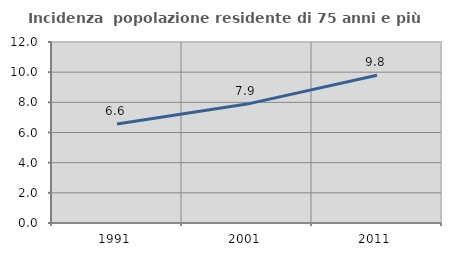
| Category | Incidenza  popolazione residente di 75 anni e più |
|---|---|
| 1991.0 | 6.558 |
| 2001.0 | 7.882 |
| 2011.0 | 9.794 |